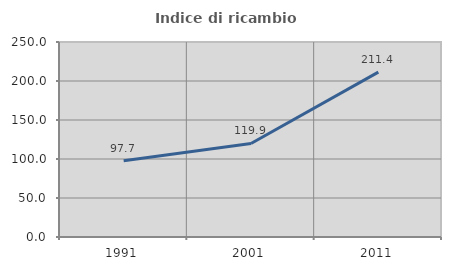
| Category | Indice di ricambio occupazionale  |
|---|---|
| 1991.0 | 97.672 |
| 2001.0 | 119.9 |
| 2011.0 | 211.398 |